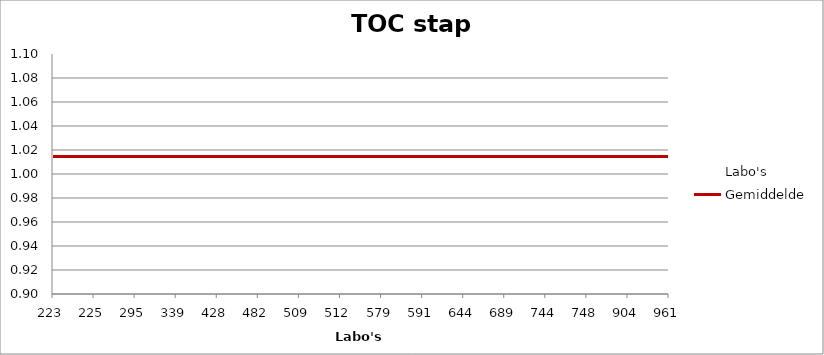
| Category | Labo's | Gemiddelde |
|---|---|---|
| 223.0 | 0.97 | 1.015 |
| 225.0 | 0.966 | 1.015 |
| 295.0 | 0.99 | 1.015 |
| 339.0 | 0.951 | 1.015 |
| 428.0 | 1.021 | 1.015 |
| 482.0 | 1.003 | 1.015 |
| 509.0 | 0.997 | 1.015 |
| 512.0 | 1.032 | 1.015 |
| 579.0 | 1.012 | 1.015 |
| 591.0 | 0.997 | 1.015 |
| 644.0 | 1.047 | 1.015 |
| 689.0 | 1.03 | 1.015 |
| 744.0 | 1.051 | 1.015 |
| 748.0 | 1.093 | 1.015 |
| 904.0 | 1.027 | 1.015 |
| 961.0 | 1.062 | 1.015 |